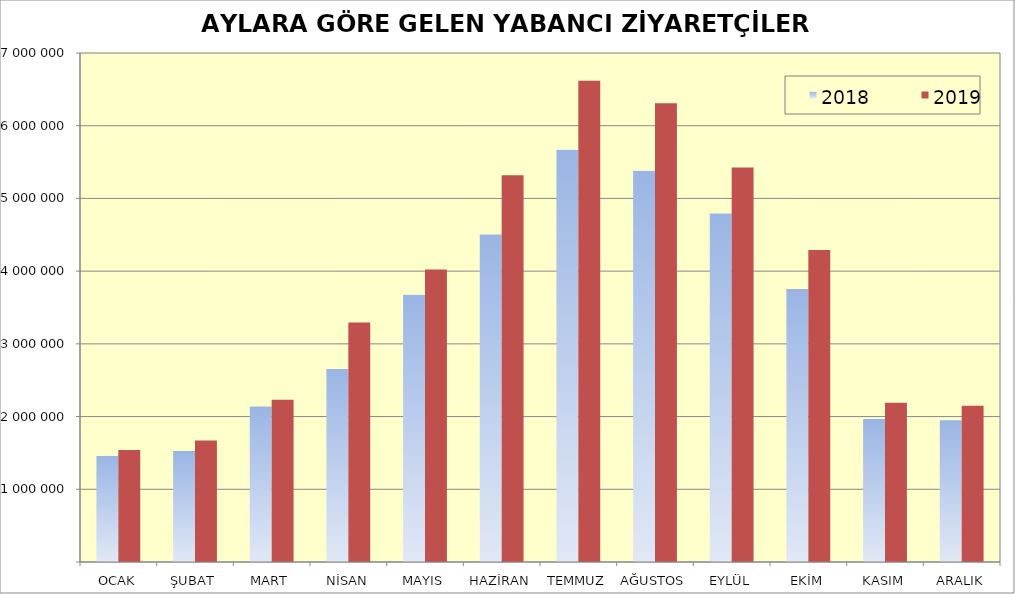
| Category | 2018 | 2019 |
|---|---|---|
| OCAK | 1461570 | 1539496 |
| ŞUBAT | 1527070 | 1670238 |
| MART | 2139766 | 2232358 |
| NİSAN | 2655561 | 3293176 |
| MAYIS | 3678440 | 4022254 |
| HAZİRAN | 4505594 | 5318984 |
| TEMMUZ | 5671801 | 6617380 |
| AĞUSTOS | 5383332 | 6307508 |
| EYLÜL | 4792818 | 5426818 |
| EKİM | 3755467 | 4291574 |
| KASIM | 1966277 | 2190622 |
| ARALIK | 1950705 | 2147878 |